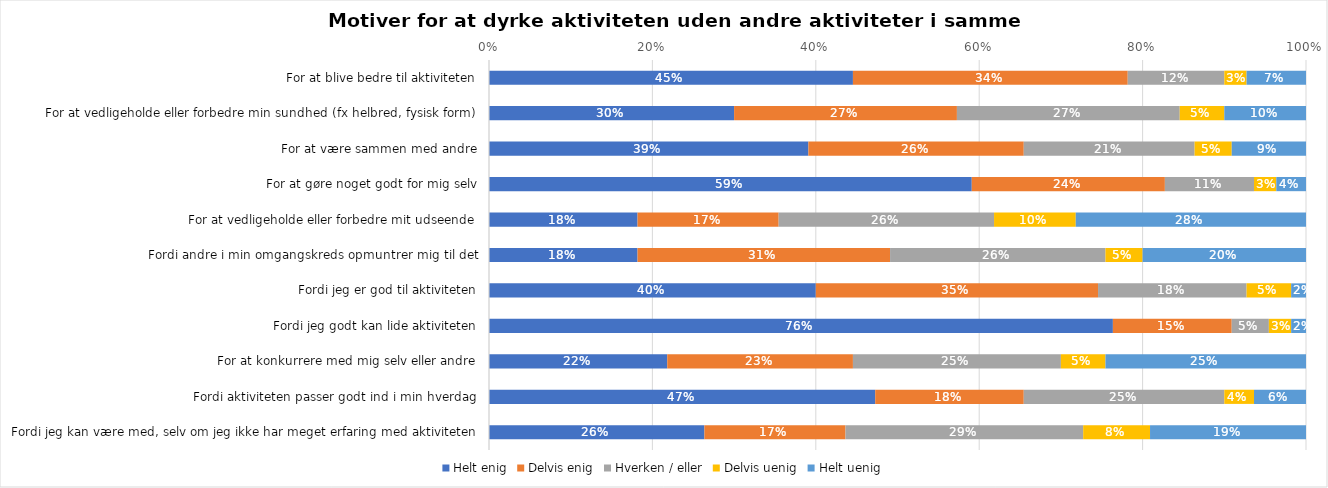
| Category | Helt enig | Delvis enig | Hverken / eller | Delvis uenig | Helt uenig |
|---|---|---|---|---|---|
| For at blive bedre til aktiviteten | 0.445 | 0.336 | 0.118 | 0.027 | 0.073 |
| For at vedligeholde eller forbedre min sundhed (fx helbred, fysisk form) | 0.3 | 0.273 | 0.273 | 0.055 | 0.1 |
| For at være sammen med andre | 0.391 | 0.264 | 0.209 | 0.045 | 0.091 |
| For at gøre noget godt for mig selv | 0.591 | 0.236 | 0.109 | 0.027 | 0.036 |
| For at vedligeholde eller forbedre mit udseende | 0.182 | 0.173 | 0.264 | 0.1 | 0.282 |
| Fordi andre i min omgangskreds opmuntrer mig til det | 0.182 | 0.309 | 0.264 | 0.045 | 0.2 |
| Fordi jeg er god til aktiviteten | 0.4 | 0.345 | 0.182 | 0.055 | 0.018 |
| Fordi jeg godt kan lide aktiviteten | 0.764 | 0.145 | 0.045 | 0.027 | 0.018 |
| For at konkurrere med mig selv eller andre | 0.218 | 0.227 | 0.255 | 0.055 | 0.245 |
| Fordi aktiviteten passer godt ind i min hverdag | 0.473 | 0.182 | 0.245 | 0.036 | 0.064 |
| Fordi jeg kan være med, selv om jeg ikke har meget erfaring med aktiviteten | 0.264 | 0.173 | 0.291 | 0.082 | 0.191 |